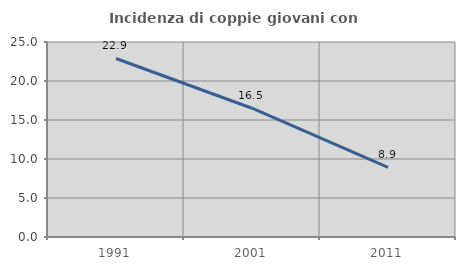
| Category | Incidenza di coppie giovani con figli |
|---|---|
| 1991.0 | 22.886 |
| 2001.0 | 16.508 |
| 2011.0 | 8.939 |